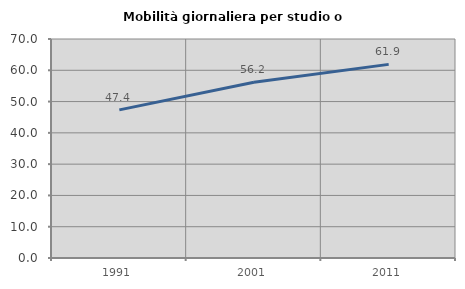
| Category | Mobilità giornaliera per studio o lavoro |
|---|---|
| 1991.0 | 47.353 |
| 2001.0 | 56.204 |
| 2011.0 | 61.887 |